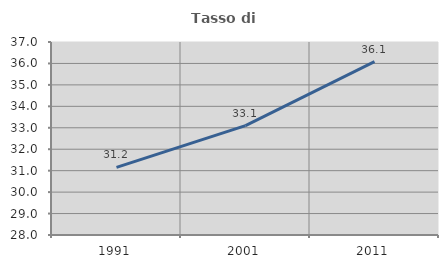
| Category | Tasso di occupazione   |
|---|---|
| 1991.0 | 31.156 |
| 2001.0 | 33.099 |
| 2011.0 | 36.083 |